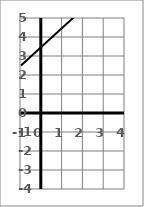
| Category | Series 16 |
|---|---|
| -1.0 | 2.5 |
| 0.0 | 3.5 |
| 1.0 | 4.5 |
| 2.0 | 5.5 |
| 3.0 | 6.5 |
| 4.0 | 7.5 |